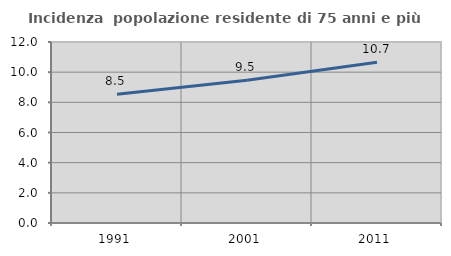
| Category | Incidenza  popolazione residente di 75 anni e più |
|---|---|
| 1991.0 | 8.53 |
| 2001.0 | 9.47 |
| 2011.0 | 10.658 |